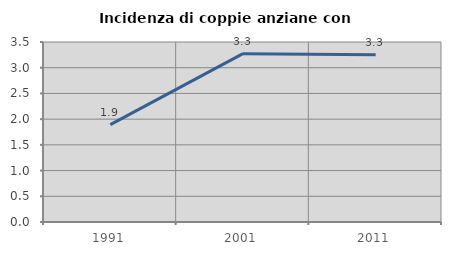
| Category | Incidenza di coppie anziane con figli |
|---|---|
| 1991.0 | 1.893 |
| 2001.0 | 3.274 |
| 2011.0 | 3.252 |